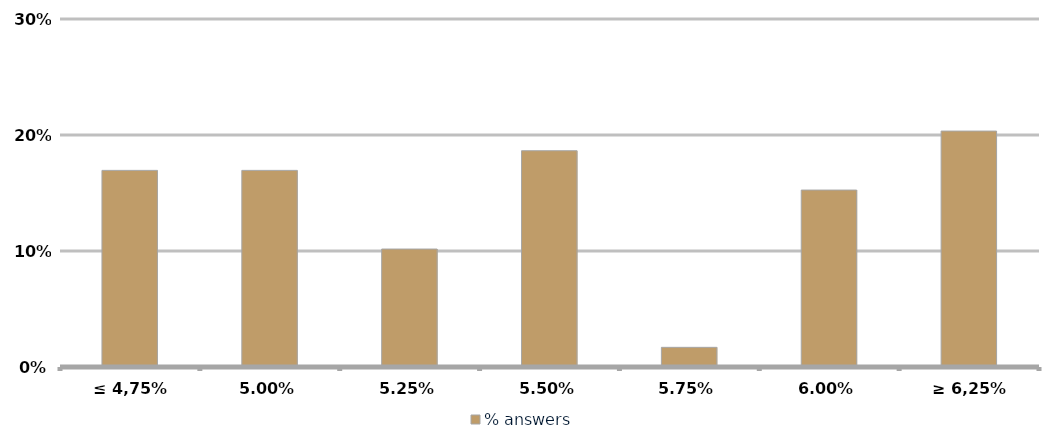
| Category | % answers |
|---|---|
| ≤ 4,75% | 0.169 |
| 5.00% | 0.169 |
| 5.25% | 0.102 |
| 5.50% | 0.186 |
| 5.75% | 0.017 |
| 6.00% | 0.153 |
| ≥ 6,25% | 0.203 |